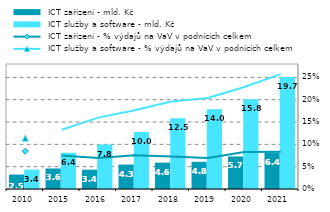
| Category |  ICT zařízení - mld. Kč |  ICT služby a software - mld. Kč |
|---|---|---|
| 2010.0 | 2.54 | 3.415 |
| 2015.0 | 3.612 | 6.388 |
| 2016.0 | 3.403 | 7.83 |
| 2017.0 | 4.301 | 10.029 |
| 2018.0 | 4.637 | 12.464 |
| 2019.0 | 4.789 | 14.041 |
| 2020.0 | 5.725 | 15.792 |
| 2021.0 | 6.397 | 19.699 |